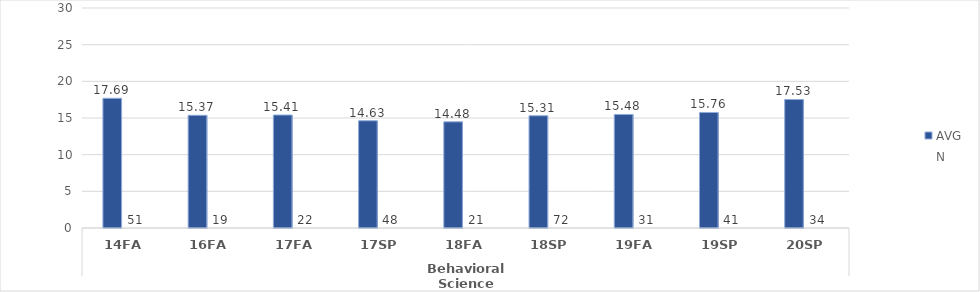
| Category |  Critical Thinking - AVG |  Critical Thinking - N |
|---|---|---|
| 0 | 17.686 | 51 |
| 1 | 15.368 | 19 |
| 2 | 15.409 | 22 |
| 3 | 14.625 | 48 |
| 4 | 14.476 | 21 |
| 5 | 15.306 | 72 |
| 6 | 15.484 | 31 |
| 7 | 15.756 | 41 |
| 8 | 17.529 | 34 |